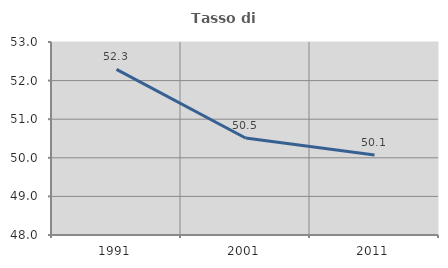
| Category | Tasso di occupazione   |
|---|---|
| 1991.0 | 52.29 |
| 2001.0 | 50.513 |
| 2011.0 | 50.075 |